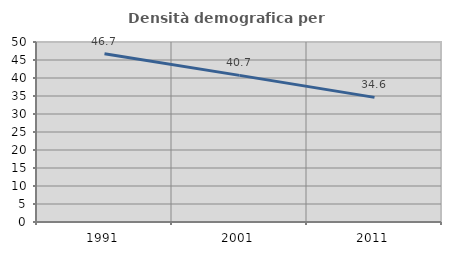
| Category | Densità demografica |
|---|---|
| 1991.0 | 46.743 |
| 2001.0 | 40.733 |
| 2011.0 | 34.614 |